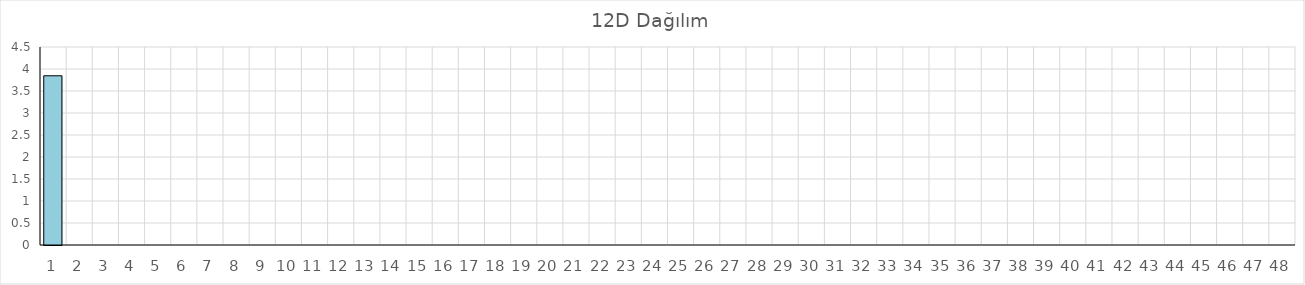
| Category | Series 0 |
|---|---|
| 0 | 3.846 |
| 1 | 0 |
| 2 | 0 |
| 3 | 0 |
| 4 | 0 |
| 5 | 0 |
| 6 | 0 |
| 7 | 0 |
| 8 | 0 |
| 9 | 0 |
| 10 | 0 |
| 11 | 0 |
| 12 | 0 |
| 13 | 0 |
| 14 | 0 |
| 15 | 0 |
| 16 | 0 |
| 17 | 0 |
| 18 | 0 |
| 19 | 0 |
| 20 | 0 |
| 21 | 0 |
| 22 | 0 |
| 23 | 0 |
| 24 | 0 |
| 25 | 0 |
| 26 | 0 |
| 27 | 0 |
| 28 | 0 |
| 29 | 0 |
| 30 | 0 |
| 31 | 0 |
| 32 | 0 |
| 33 | 0 |
| 34 | 0 |
| 35 | 0 |
| 36 | 0 |
| 37 | 0 |
| 38 | 0 |
| 39 | 0 |
| 40 | 0 |
| 41 | 0 |
| 42 | 0 |
| 43 | 0 |
| 44 | 0 |
| 45 | 0 |
| 46 | 0 |
| 47 | 0 |